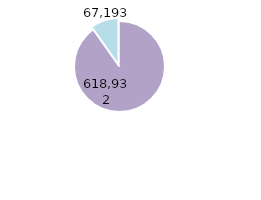
| Category | Series 0 |
|---|---|
| Mujeres | 618932 |
| Hombres | 67193 |